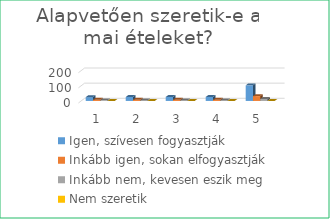
| Category | Igen, szívesen fogyasztják | Inkább igen, sokan elfogyasztják | Inkább nem, kevesen eszik meg | Nem szeretik |
|---|---|---|---|---|
| 0 | 25 | 8 | 4 | 0 |
| 1 | 26 | 8 | 3 | 0 |
| 2 | 26 | 8 | 3 | 0 |
| 3 | 26 | 8 | 3 | 0 |
| 4 | 103 | 32 | 13 | 0 |